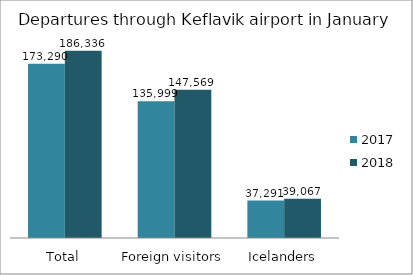
| Category | 2017 | 2018 |
|---|---|---|
| Total | 173290 | 186336 |
| Foreign visitors | 135999 | 147569 |
| Icelanders | 37291 | 39067 |